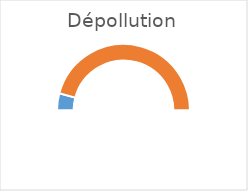
| Category | Series 0 |
|---|---|
| 0 | 0.083 |
| 1 | 0.917 |
| 2 | 1 |